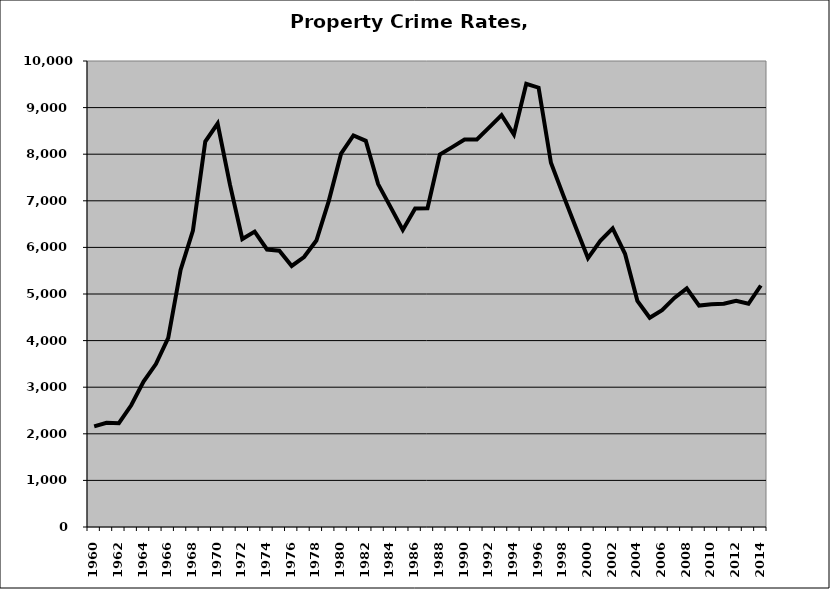
| Category | Property |
|---|---|
| 1960.0 | 2159.156 |
| 1961.0 | 2237.433 |
| 1962.0 | 2226.786 |
| 1963.0 | 2612.03 |
| 1964.0 | 3121.535 |
| 1965.0 | 3497.011 |
| 1966.0 | 4057.178 |
| 1967.0 | 5517.182 |
| 1968.0 | 6362.546 |
| 1969.0 | 8270.927 |
| 1970.0 | 8656.594 |
| 1971.0 | 7345.749 |
| 1972.0 | 6179.813 |
| 1973.0 | 6339.812 |
| 1974.0 | 5954.91 |
| 1975.0 | 5929.19 |
| 1976.0 | 5602.137 |
| 1977.0 | 5793.913 |
| 1978.0 | 6147.626 |
| 1979.0 | 6993.445 |
| 1980.0 | 8012.178 |
| 1981.0 | 8402.83 |
| 1982.0 | 8287.639 |
| 1983.0 | 7358.427 |
| 1984.0 | 6869.823 |
| 1985.0 | 6374.441 |
| 1986.0 | 6834.026 |
| 1987.0 | 6841.318 |
| 1988.0 | 7993.065 |
| 1989.0 | 8151.49 |
| 1990.0 | 8316.032 |
| 1991.0 | 8314.716 |
| 1992.0 | 8574.194 |
| 1993.0 | 8839.273 |
| 1994.0 | 8422.632 |
| 1995.0 | 9512.094 |
| 1996.0 | 9426.888 |
| 1997.0 | 7814.934 |
| 1998.0 | 7117.017 |
| 1999.0 | 6439.306 |
| 2000.0 | 5768.636 |
| 2001.0 | 6139.883 |
| 2002.0 | 6408.952 |
| 2003.0 | 5863.491 |
| 2004.0 | 4852.78 |
| 2005.0 | 4489.828 |
| 2006.0 | 4653.93 |
| 2007.0 | 4916.266 |
| 2008.0 | 5119.866 |
| 2009.0 | 4751.883 |
| 2010.0 | 4778.943 |
| 2011.0 | 4790.475 |
| 2012.0 | 4855.65 |
| 2013.0 | 4790.706 |
| 2014.0 | 5182.48 |